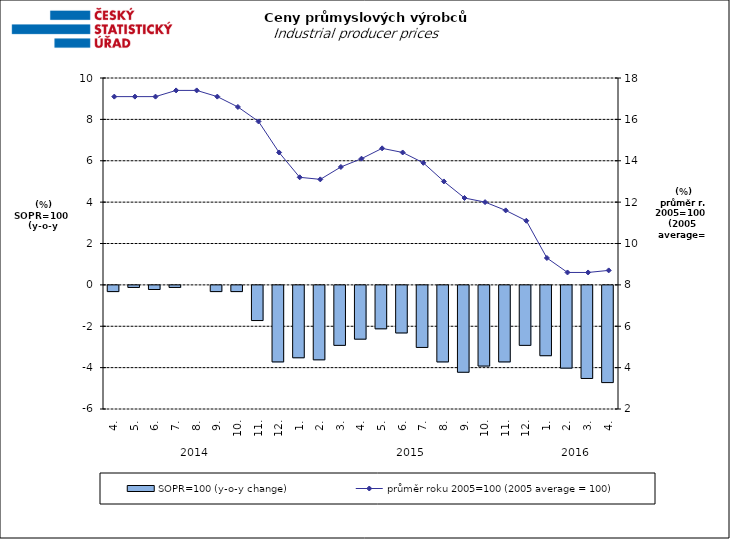
| Category | SOPR=100 (y-o-y change)   |
|---|---|
| 0 | -0.3 |
| 1 | -0.1 |
| 2 | -0.2 |
| 3 | -0.1 |
| 4 | 0 |
| 5 | -0.3 |
| 6 | -0.3 |
| 7 | -1.7 |
| 8 | -3.7 |
| 9 | -3.5 |
| 10 | -3.6 |
| 11 | -2.9 |
| 12 | -2.6 |
| 13 | -2.1 |
| 14 | -2.3 |
| 15 | -3 |
| 16 | -3.7 |
| 17 | -4.2 |
| 18 | -3.9 |
| 19 | -3.7 |
| 20 | -2.9 |
| 21 | -3.4 |
| 22 | -4 |
| 23 | -4.5 |
| 24 | -4.7 |